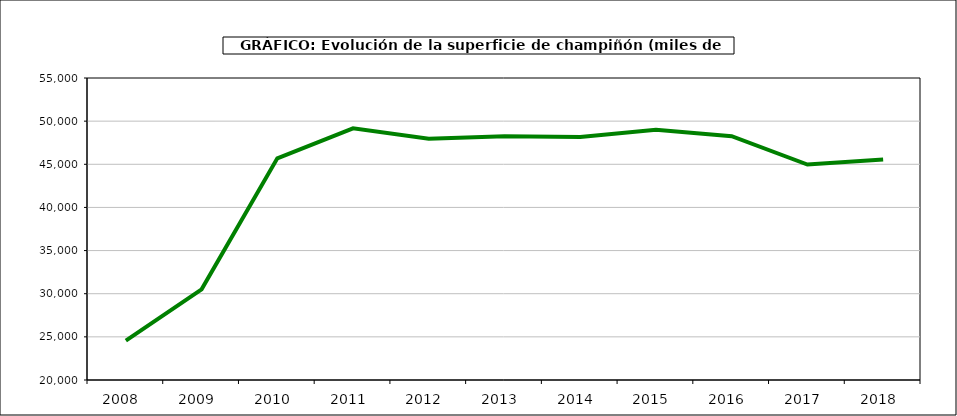
| Category | superficie |
|---|---|
| 2008.0 | 24567 |
| 2009.0 | 30509 |
| 2010.0 | 45697 |
| 2011.0 | 49173 |
| 2012.0 | 47970 |
| 2013.0 | 48261 |
| 2014.0 | 48171 |
| 2015.0 | 48998 |
| 2016.0 | 48254 |
| 2017.0 | 44974 |
| 2018.0 | 45565 |